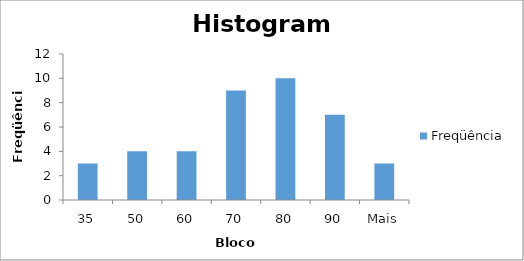
| Category | Freqüência |
|---|---|
| 35 | 3 |
| 50 | 4 |
| 60 | 4 |
| 70 | 9 |
| 80 | 10 |
| 90 | 7 |
| Mais | 3 |